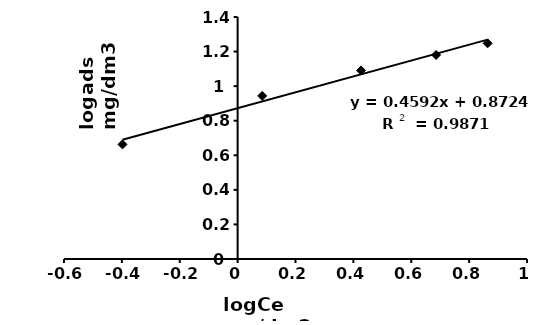
| Category | log ads mg/dm3 |
|---|---|
| -0.3979400086720376 | 0.663 |
| 0.08493357493671612 | 0.944 |
| 0.42651126136457523 | 1.091 |
| 0.6857417386022636 | 1.18 |
| 0.8639173769578604 | 1.248 |